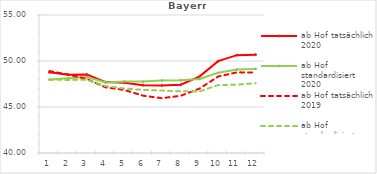
| Category | ab Hof tatsächlich 2020 | ab Hof standardisiert 2020 | ab Hof tatsächlich 2019 | ab Hof standardisiert 2019 |
|---|---|---|---|---|
| 0 | 48.769 | 47.981 | 48.911 | 47.961 |
| 1 | 48.497 | 48.113 | 48.522 | 47.944 |
| 2 | 48.519 | 48.252 | 48.036 | 47.957 |
| 3 | 47.706 | 47.663 | 47.137 | 47.274 |
| 4 | 47.637 | 47.771 | 46.851 | 47.006 |
| 5 | 47.375 | 47.759 | 46.228 | 46.862 |
| 6 | 47.346 | 47.879 | 45.959 | 46.787 |
| 7 | 47.419 | 47.919 | 46.221 | 46.701 |
| 8 | 48.304 | 48.041 | 46.991 | 46.692 |
| 9 | 49.988 | 48.714 | 48.312 | 47.378 |
| 10 | 50.636 | 49.068 | 48.767 | 47.432 |
| 11 | 50.693 | 49.141 | 48.749 | 47.586 |